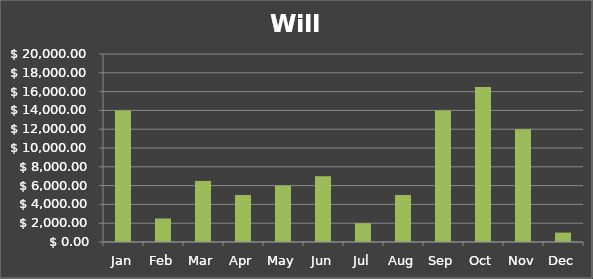
| Category | Will |
|---|---|
| Jan | 14000 |
| Feb | 2500 |
| Mar | 6500 |
| Apr | 5000 |
| May | 6000 |
| Jun | 7000 |
| Jul | 2000 |
| Aug | 5000 |
| Sep | 14000 |
| Oct | 16500 |
| Nov | 12000 |
| Dec | 1000 |